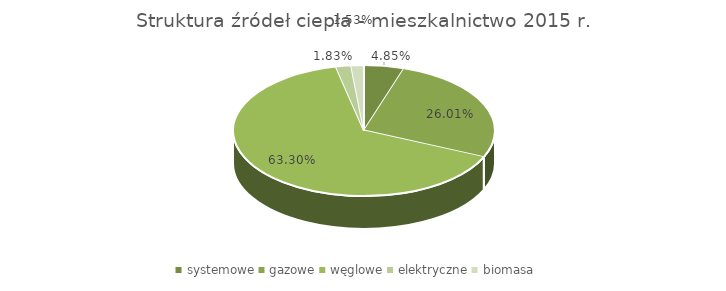
| Category | Series 0 |
|---|---|
| systemowe | 0.048 |
| gazowe | 0.26 |
| węglowe | 0.633 |
| elektryczne | 0.018 |
| biomasa | 0.015 |